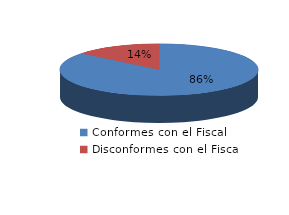
| Category | Series 0 |
|---|---|
| 0 | 2336 |
| 1 | 384 |